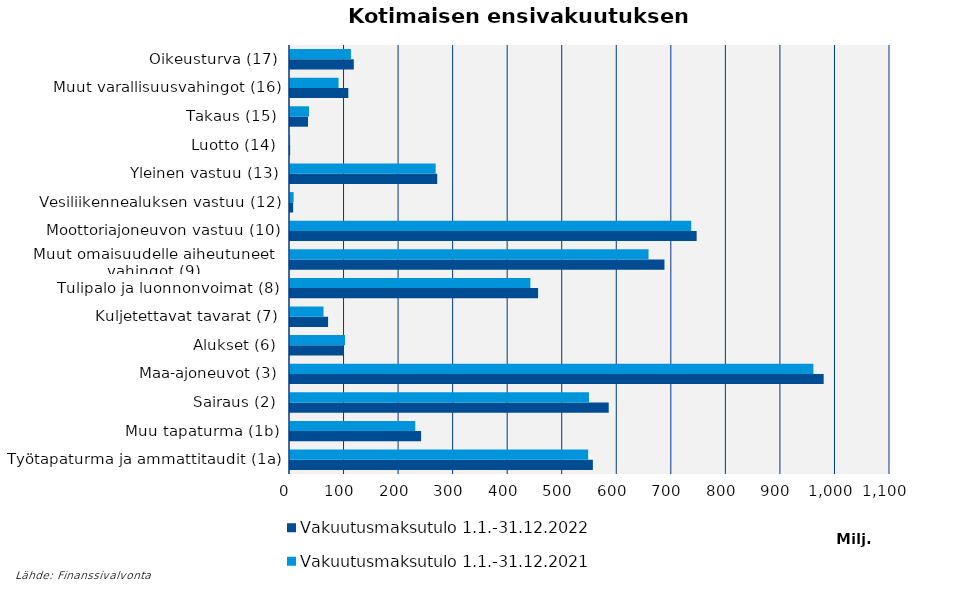
| Category | Vakuutusmaksutulo |
|---|---|
| Työtapaturma ja ammattitaudit (1a) | 546603.494 |
| Muu tapaturma (1b) | 229666.634 |
| Sairaus (2) | 548147.112 |
| Maa-ajoneuvot (3) | 959533.408 |
| Alukset (6) | 100976.853 |
| Kuljetettavat tavarat (7) | 61440.176 |
| Tulipalo ja luonnonvoimat (8) | 440706.467 |
| Muut omaisuudelle aiheutuneet 
vahingot (9) | 657311.877 |
| Moottoriajoneuvon vastuu (10) | 735547.806 |
| Vesiliikennealuksen vastuu (12) | 6641.662 |
| Yleinen vastuu (13) | 267045.957 |
| Luotto (14) | 262.555 |
| Takaus (15) | 34864.393 |
| Muut varallisuusvahingot (16) | 89013.981 |
| Oikeusturva (17) | 111682.6 |